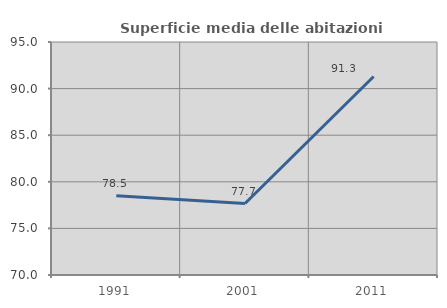
| Category | Superficie media delle abitazioni occupate |
|---|---|
| 1991.0 | 78.508 |
| 2001.0 | 77.669 |
| 2011.0 | 91.297 |